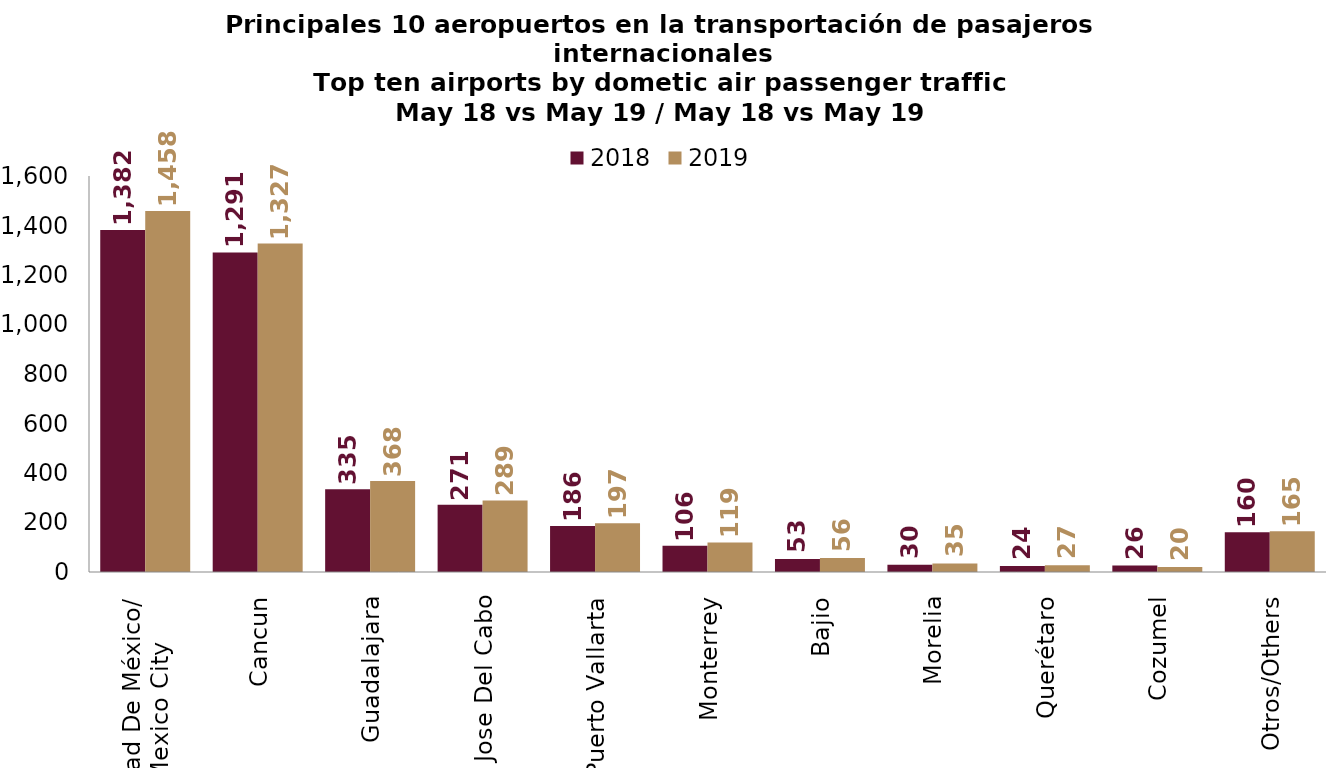
| Category | 2018 | 2019 |
|---|---|---|
| Ciudad De México/
Mexico City | 1381.981 | 1458.486 |
| Cancun | 1290.911 | 1327.014 |
| Guadalajara | 334.772 | 367.989 |
| San Jose Del Cabo | 271.497 | 289.047 |
| Puerto Vallarta | 185.679 | 196.685 |
| Monterrey | 106.427 | 119.469 |
| Bajio | 52.993 | 56.136 |
| Morelia | 29.549 | 34.727 |
| Querétaro | 23.782 | 27.023 |
| Cozumel | 26.031 | 19.919 |
| Otros/Others | 160.108 | 164.979 |